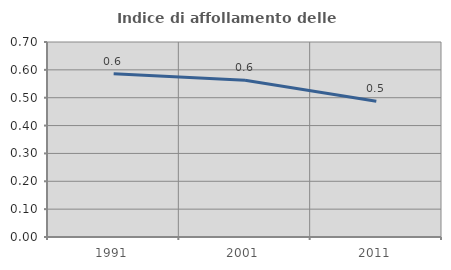
| Category | Indice di affollamento delle abitazioni  |
|---|---|
| 1991.0 | 0.586 |
| 2001.0 | 0.563 |
| 2011.0 | 0.487 |